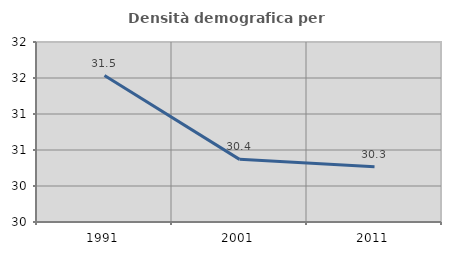
| Category | Densità demografica |
|---|---|
| 1991.0 | 31.535 |
| 2001.0 | 30.37 |
| 2011.0 | 30.267 |